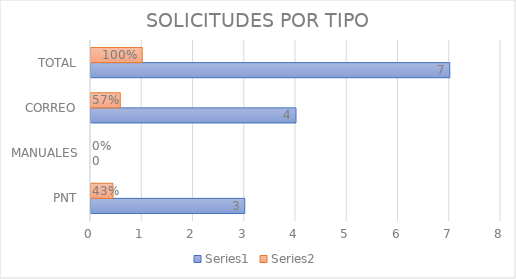
| Category | Series 0 | Series 1 |
|---|---|---|
| PNT | 3 | 0.429 |
| MANUALES | 0 | 0 |
| CORREO | 4 | 0.571 |
| TOTAL | 7 | 1 |